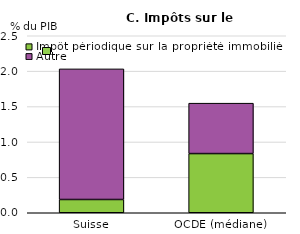
| Category | Impôt périodique sur la propriété immobilière | Autre |
|---|---|---|
| Suisse | 0.187 | 1.845 |
| OCDE (médiane) | 0.836 | 0.712 |